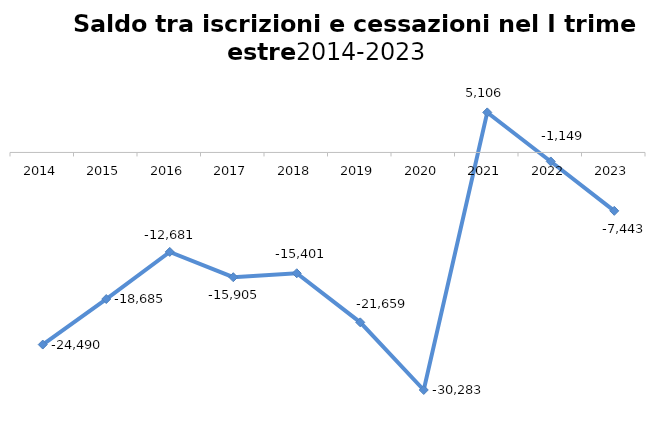
| Category | SALDO |
|---|---|
| 2014.0 | -24490 |
| 2015.0 | -18685 |
| 2016.0 | -12681 |
| 2017.0 | -15905 |
| 2018.0 | -15401 |
| 2019.0 | -21659 |
| 2020.0 | -30283 |
| 2021.0 | 5106 |
| 2022.0 | -1149 |
| 2023.0 | -7443 |